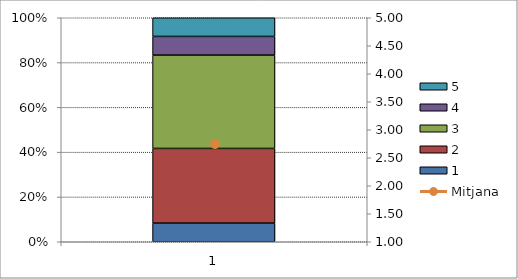
| Category | 1 | 2 | 3 | 4 | 5 |
|---|---|---|---|---|---|
| 0 | 2 | 8 | 10 | 2 | 2 |